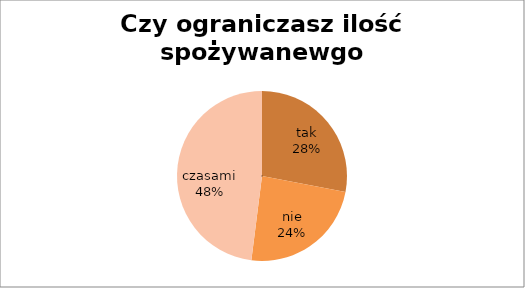
| Category | Czy ograniczasz ilość spożywanewgo tłuszczu? |
|---|---|
| tak | 28 |
| nie | 24 |
| czasami | 48 |